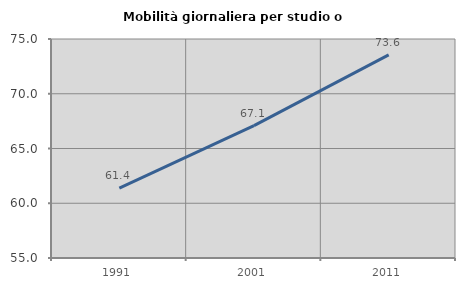
| Category | Mobilità giornaliera per studio o lavoro |
|---|---|
| 1991.0 | 61.389 |
| 2001.0 | 67.088 |
| 2011.0 | 73.551 |